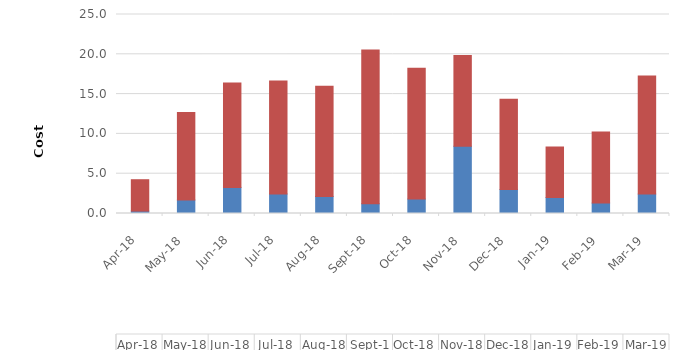
| Category | Buy Cost | Sell Cost |
|---|---|---|
| 2018-04-01 | 0.303 | 3.941 |
| 2018-05-01 | 1.699 | 10.997 |
| 2018-06-01 | 3.282 | 13.119 |
| 2018-07-01 | 2.458 | 14.199 |
| 2018-08-01 | 2.146 | 13.847 |
| 2018-09-01 | 1.223 | 19.302 |
| 2018-10-01 | 1.81 | 16.435 |
| 2018-11-01 | 8.434 | 11.429 |
| 2018-12-01 | 3.021 | 11.342 |
| 2019-01-01 | 2.012 | 6.352 |
| 2019-02-01 | 1.307 | 8.94 |
| 2019-03-01 | 2.437 | 14.838 |